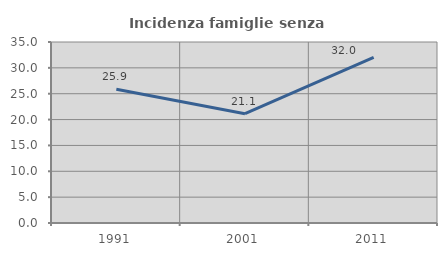
| Category | Incidenza famiglie senza nuclei |
|---|---|
| 1991.0 | 25.854 |
| 2001.0 | 21.143 |
| 2011.0 | 32.009 |